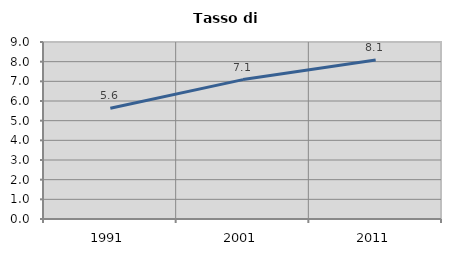
| Category | Tasso di disoccupazione   |
|---|---|
| 1991.0 | 5.632 |
| 2001.0 | 7.088 |
| 2011.0 | 8.083 |